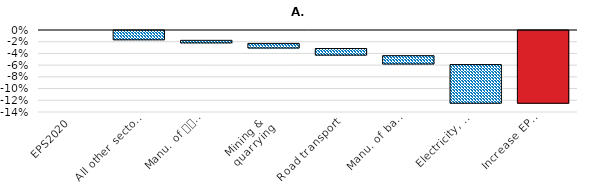
| Category | Series 1 | Series 2 |
|---|---|---|
| EPS2020 | 0 | 0 |
| All other sectors | 0 | -0.018 |
| Manu. of 
chemicals/pharma | -0.018 | -0.005 |
| Mining & 
quarrying | -0.023 | -0.009 |
| Road transport | -0.032 | -0.012 |
| Manu. of basic
 metals | -0.044 | -0.015 |
| Electricity, gas
 & water supply | -0.059 | -0.067 |
| Increase EPS
 by 1 unit | -0.126 | 0 |